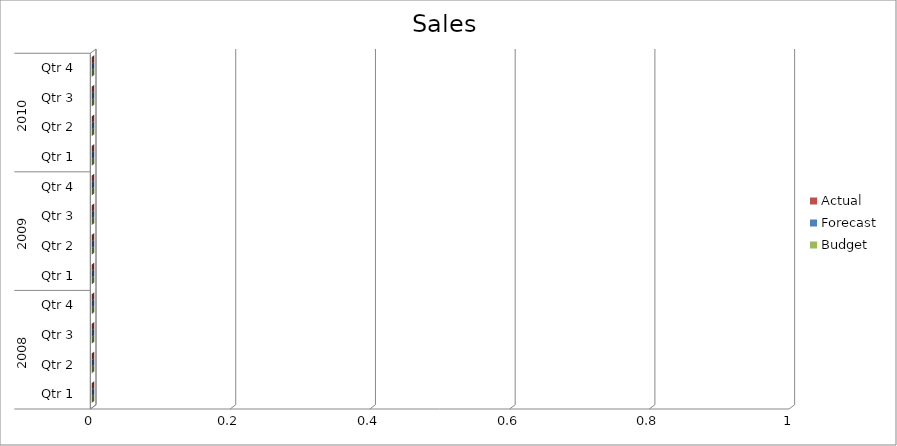
| Category | Budget | Forecast | Actual |
|---|---|---|---|
| 0 | 1440 | 2210 | 3260 |
| 1 | 2730 | 2610 | 3270 |
| 2 | 2800 | 2480 | 2100 |
| 3 | 1060 | 3220 | 3460 |
| 4 | 2950 | 1280 | 2000 |
| 5 | 2710 | 1610 | 1530 |
| 6 | 3090 | 1290 | 650 |
| 7 | 2810 | 680 | 3070 |
| 8 | 1570 | 1350 | 2590 |
| 9 | 3490 | 2400 | 2490 |
| 10 | 3100 | 2290 | 1050 |
| 11 | 1410 | 3340 | 3440 |